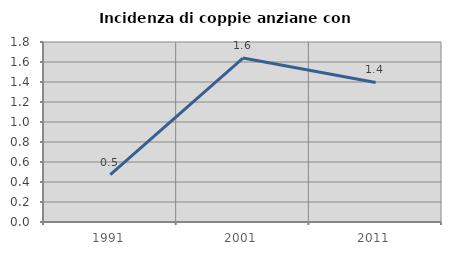
| Category | Incidenza di coppie anziane con figli |
|---|---|
| 1991.0 | 0.474 |
| 2001.0 | 1.639 |
| 2011.0 | 1.395 |